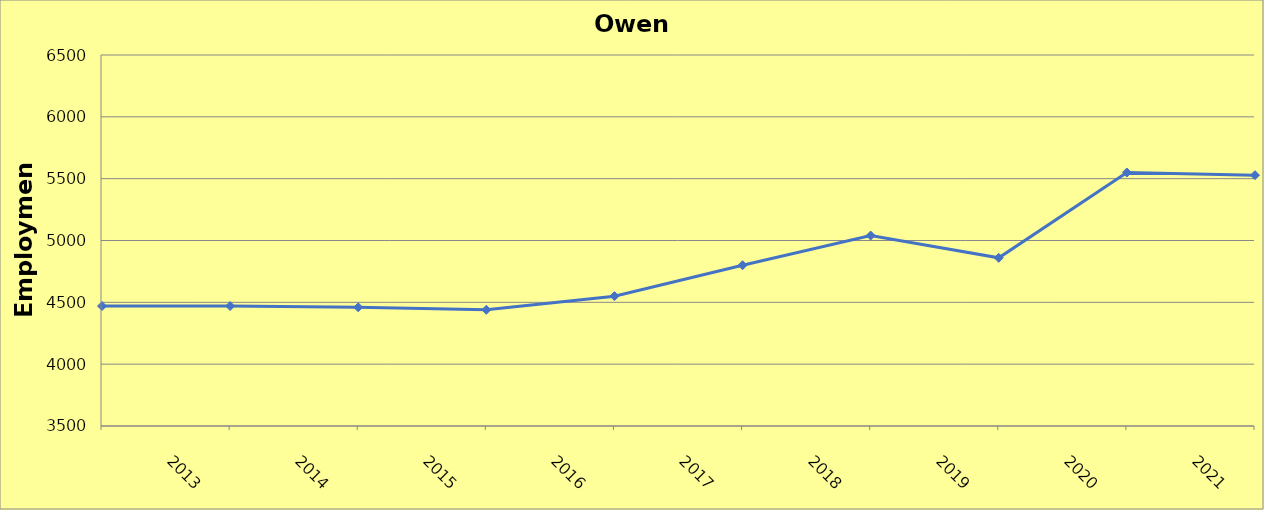
| Category | Owen County |
|---|---|
| 2013.0 | 4470 |
| 2014.0 | 4470 |
| 2015.0 | 4460 |
| 2016.0 | 4440 |
| 2017.0 | 4550 |
| 2018.0 | 4800 |
| 2019.0 | 5040 |
| 2020.0 | 4860 |
| 2021.0 | 5550 |
| 2022.0 | 5528 |